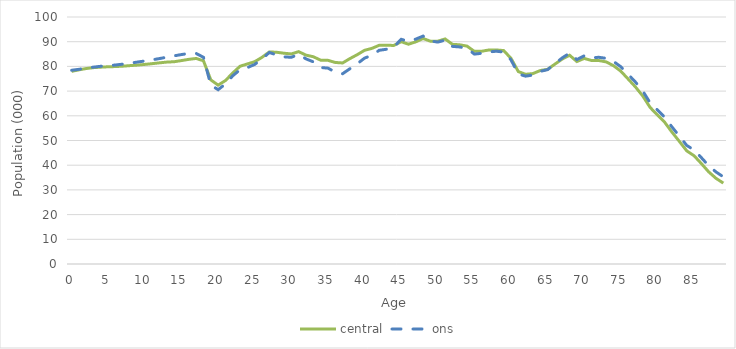
| Category | central | ons |
|---|---|---|
| 0.0 | 77.996 | 78.438 |
| 1.0 | 78.614 | 78.818 |
| 2.0 | 79.14 | 79.301 |
| 3.0 | 79.507 | 79.702 |
| 4.0 | 79.696 | 80.055 |
| 5.0 | 79.852 | 80.284 |
| 6.0 | 79.932 | 80.57 |
| 7.0 | 80.098 | 80.926 |
| 8.0 | 80.324 | 81.331 |
| 9.0 | 80.534 | 81.763 |
| 10.0 | 80.805 | 82.197 |
| 11.0 | 81.111 | 82.663 |
| 12.0 | 81.445 | 83.173 |
| 13.0 | 81.744 | 83.746 |
| 14.0 | 81.893 | 84.28 |
| 15.0 | 82.359 | 84.796 |
| 16.0 | 82.856 | 85.238 |
| 17.0 | 83.215 | 85.238 |
| 18.0 | 82.27 | 83.69 |
| 19.0 | 74.548 | 72.471 |
| 20.0 | 72.419 | 70.569 |
| 21.0 | 74.259 | 72.884 |
| 22.0 | 77.335 | 76.191 |
| 23.0 | 80.066 | 78.658 |
| 24.0 | 80.995 | 79.512 |
| 25.0 | 81.914 | 80.797 |
| 26.0 | 83.691 | 83.044 |
| 27.0 | 85.863 | 85.635 |
| 28.0 | 85.72 | 84.637 |
| 29.0 | 85.33 | 83.851 |
| 30.0 | 85.047 | 83.685 |
| 31.0 | 85.979 | 84.871 |
| 32.0 | 84.564 | 83.047 |
| 33.0 | 83.916 | 81.85 |
| 34.0 | 82.531 | 79.554 |
| 35.0 | 82.457 | 79.293 |
| 36.0 | 81.591 | 77.701 |
| 37.0 | 81.393 | 77.029 |
| 38.0 | 83.159 | 79.057 |
| 39.0 | 84.741 | 81.053 |
| 40.0 | 86.519 | 83.352 |
| 41.0 | 87.293 | 84.498 |
| 42.0 | 88.549 | 86.518 |
| 43.0 | 88.573 | 86.945 |
| 44.0 | 88.48 | 87.864 |
| 45.0 | 90.002 | 90.978 |
| 46.0 | 88.983 | 90.148 |
| 47.0 | 89.947 | 91.057 |
| 48.0 | 91.294 | 92.275 |
| 49.0 | 90.196 | 90.288 |
| 50.0 | 90.199 | 89.848 |
| 51.0 | 91.112 | 90.612 |
| 52.0 | 88.94 | 88.111 |
| 53.0 | 88.749 | 87.871 |
| 54.0 | 88.204 | 87.263 |
| 55.0 | 86.087 | 84.978 |
| 56.0 | 86.142 | 85.312 |
| 57.0 | 86.648 | 85.859 |
| 58.0 | 86.656 | 86.142 |
| 59.0 | 86.416 | 85.812 |
| 60.0 | 83.259 | 82.647 |
| 61.0 | 77.909 | 76.94 |
| 62.0 | 76.796 | 76.046 |
| 63.0 | 77.103 | 76.511 |
| 64.0 | 78.328 | 77.988 |
| 65.0 | 78.815 | 78.691 |
| 66.0 | 80.924 | 81.065 |
| 67.0 | 82.978 | 83.446 |
| 68.0 | 84.526 | 85.382 |
| 69.0 | 81.962 | 82.765 |
| 70.0 | 83.23 | 84.282 |
| 71.0 | 82.395 | 83.486 |
| 72.0 | 82.371 | 83.686 |
| 73.0 | 81.825 | 83.259 |
| 74.0 | 80.282 | 81.998 |
| 75.0 | 78.057 | 79.861 |
| 76.0 | 74.887 | 76.78 |
| 77.0 | 71.672 | 73.647 |
| 78.0 | 68.003 | 69.997 |
| 79.0 | 63.384 | 65.263 |
| 80.0 | 60.329 | 62.341 |
| 81.0 | 57.337 | 59.402 |
| 82.0 | 53.329 | 55.427 |
| 83.0 | 49.618 | 51.764 |
| 84.0 | 45.8 | 47.999 |
| 85.0 | 43.831 | 46.187 |
| 86.0 | 40.66 | 43.037 |
| 87.0 | 37.299 | 39.796 |
| 88.0 | 34.672 | 37.267 |
| 89.0 | 32.748 | 35.28 |